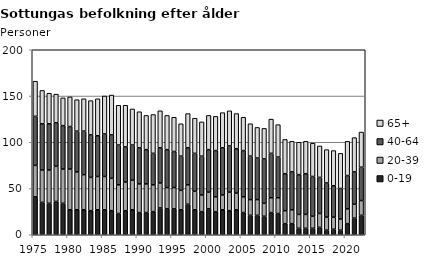
| Category | 0-19 | 20-39 | 40-64 | 65+ |
|---|---|---|---|---|
| 1975.0 | 41 | 34 | 53 | 38 |
| 1976.0 | 35 | 35 | 50 | 36 |
| 1977.0 | 34 | 36 | 50 | 33 |
| 1978.0 | 36 | 38 | 47 | 31 |
| 1979.0 | 34 | 37 | 47 | 30 |
| 1980.0 | 27 | 44 | 46 | 32 |
| 1981.0 | 27 | 41 | 44 | 34 |
| 1982.0 | 27 | 38 | 47 | 35 |
| 1983.0 | 26 | 36 | 46 | 37 |
| 1984.0 | 27 | 36 | 44 | 40 |
| 1985.0 | 27 | 36 | 46 | 41 |
| 1986.0 | 26 | 35 | 47 | 43 |
| 1987.0 | 23 | 31 | 43 | 43 |
| 1988.0 | 26 | 31 | 38 | 45 |
| 1989.0 | 27 | 32 | 38 | 39 |
| 1990.0 | 24 | 31 | 39 | 39 |
| 1991.0 | 24 | 31 | 37 | 37 |
| 1992.0 | 25 | 29 | 34 | 42 |
| 1993.0 | 29 | 27 | 38 | 40 |
| 1994.0 | 28 | 23 | 41 | 37 |
| 1995.0 | 28 | 23 | 39 | 37 |
| 1996.0 | 27 | 21 | 37 | 35 |
| 1997.0 | 33 | 21 | 40 | 37 |
| 1998.0 | 27 | 20 | 41 | 38 |
| 1999.0 | 25 | 18 | 42 | 37 |
| 2000.0 | 28 | 18 | 46 | 37 |
| 2001.0 | 25 | 16 | 50 | 37 |
| 2002.0 | 27 | 16 | 51 | 38 |
| 2003.0 | 26 | 20 | 50 | 38 |
| 2004.0 | 27 | 18 | 48 | 38 |
| 2005.0 | 24 | 17 | 50 | 36 |
| 2006.0 | 21 | 17 | 47 | 35 |
| 2007.0 | 21 | 17 | 45 | 33 |
| 2008.0 | 20 | 14 | 48 | 33 |
| 2009.0 | 24 | 16 | 48 | 37 |
| 2010.0 | 23 | 17 | 44 | 35 |
| 2011.0 | 12 | 14 | 40 | 37 |
| 2012.0 | 12 | 15 | 41 | 33 |
| 2013.0 | 7 | 15 | 43 | 35 |
| 2014.0 | 7 | 15 | 44 | 35 |
| 2015.0 | 7 | 13 | 43 | 36 |
| 2016.0 | 8 | 15 | 39 | 34 |
| 2017.0 | 5 | 14 | 37 | 36 |
| 2018.0 | 6 | 13 | 34 | 38 |
| 2019.0 | 5 | 12 | 33 | 38 |
| 2020.0 | 12 | 16 | 36 | 37 |
| 2021.0 | 18 | 15 | 35 | 37 |
| 2022.0 | 21 | 16 | 36 | 38 |